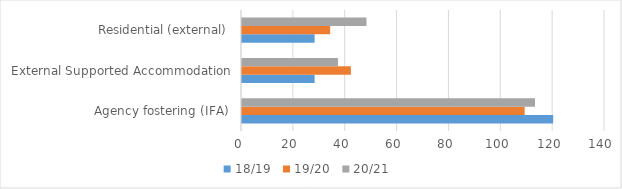
| Category | 18/19 | 19/20 | 20/21 |
|---|---|---|---|
| Agency fostering (IFA) | 120 | 109 | 113 |
| External Supported Accommodation | 28 | 42 | 37 |
| Residential (external) | 28 | 34 | 48 |